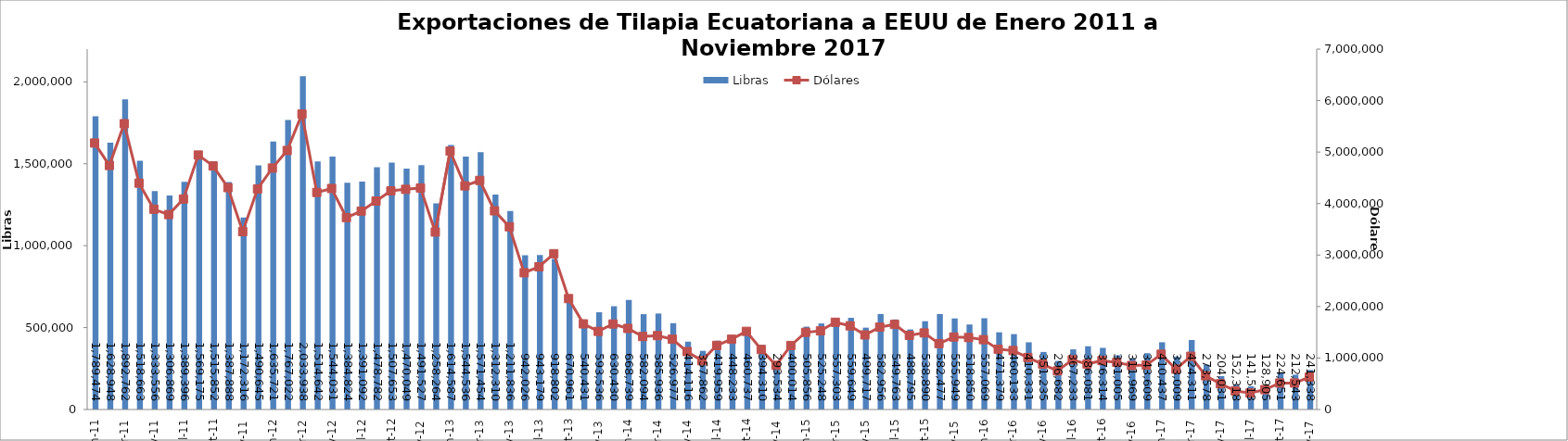
| Category | Libras  |
|---|---|
| 2011-01-01 | 1789473.82 |
| 2011-02-01 | 1628948.076 |
| 2011-03-01 | 1892761.535 |
| 2011-04-01 | 1518662.961 |
| 2011-05-01 | 1333555.926 |
| 2011-06-01 | 1306869.243 |
| 2011-07-01 | 1389396.24 |
| 2011-08-01 | 1569174.756 |
| 2011-09-01 | 1515852.096 |
| 2011-10-01 | 1387888.293 |
| 2011-11-01 | 1172315.891 |
| 2011-12-01 | 1490644.699 |
| 2012-01-01 | 1635720.607 |
| 2012-02-01 | 1767022.174 |
| 2012-03-01 | 2033937.505 |
| 2012-04-01 | 1514641.77 |
| 2012-05-01 | 1544031.293 |
| 2012-06-01 | 1384823.899 |
| 2012-07-01 | 1391091.577 |
| 2012-08-01 | 1478781.747 |
| 2012-09-01 | 1507653.188 |
| 2012-10-01 | 1470049.326 |
| 2012-11-01 | 1491526.539 |
| 2012-12-01 | 1258264 |
| 2013-01-01 | 1614587 |
| 2013-02-01 | 1544536.146 |
| 2013-03-01 | 1571454.312 |
| 2013-04-01 | 1312310.196 |
| 2013-05-01 | 1211835.551 |
| 2013-06-01 | 942025.58 |
| 2013-07-01 | 943178.586 |
| 2013-08-01 | 918802.324 |
| 2013-09-01 | 670961.192 |
| 2013-10-01 | 540431.235 |
| 2013-11-01 | 593535.64 |
| 2013-12-01 | 630429.621 |
| 2014-01-01 | 668739 |
| 2014-02-01 | 582093.766 |
| 2014-03-01 | 585936.383 |
| 2014-04-01 | 526976.561 |
| 2014-05-01 | 414116.473 |
| 2014-06-01 | 357861.695 |
| 2014-07-01 | 419958.663 |
| 2014-08-01 | 448233 |
| 2014-09-01 | 460737.149 |
| 2014-10-01 | 394310.347 |
| 2014-11-01 | 293533.672 |
| 2014-12-01 | 400013.647 |
| 2015-01-01 | 505856.493 |
| 2015-02-01 | 525248 |
| 2015-03-01 | 557303.039 |
| 2015-04-01 | 559648.733 |
| 2015-05-01 | 499716.682 |
| 2015-06-01 | 582955.764 |
| 2015-07-01 | 549763.307 |
| 2015-08-01 | 488795.094 |
| 2015-09-01 | 538890.219 |
| 2015-10-01 | 582477.366 |
| 2015-11-01 | 555949.414 |
| 2015-12-01 | 518850.405 |
| 2016-01-01 | 557069.351 |
| 2016-02-01 | 471378.754 |
| 2016-03-01 | 460133.089 |
| 2016-04-01 | 410331.175 |
| 2016-05-01 | 351235 |
| 2016-06-01 | 296682 |
| 2016-07-01 | 367233.45 |
| 2016-08-01 | 386080.575 |
| 2016-09-01 | 376314.197 |
| 2016-10-01 | 331005.258 |
| 2016-11-01 | 311968.537 |
| 2016-12-01 | 343608.956 |
| 2017-01-01 | 410436.996 |
| 2017-02-01 | 323009.174 |
| 2017-03-01 | 424310.544 |
| 2017-04-01 | 273577.632 |
| 2017-05-01 | 204031.321 |
| 2017-06-01 | 152318.019 |
| 2017-07-01 | 141513.274 |
| 2017-08-01 | 128905.167 |
| 2017-09-01 | 224650.945 |
| 2017-10-01 | 212543.281 |
| 2017-11-01 | 241337.562 |